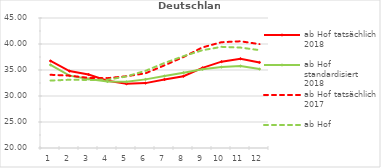
| Category | ab Hof tatsächlich 2018 | ab Hof standardisiert 2018 | ab Hof tatsächlich 2017 | ab Hof standardisiert 2017 |
|---|---|---|---|---|
| 0 | 36.74 | 35.978 | 34.079 | 32.971 |
| 1 | 34.791 | 33.912 | 33.913 | 33.12 |
| 2 | 34.128 | 33.286 | 33.489 | 33.089 |
| 3 | 32.949 | 32.785 | 33.435 | 33.123 |
| 4 | 32.357 | 32.721 | 33.804 | 33.767 |
| 5 | 32.477 | 33.196 | 34.365 | 34.841 |
| 6 | 33.178 | 33.831 | 35.896 | 36.349 |
| 7 | 33.807 | 34.482 | 37.501 | 37.66 |
| 8 | 35.418 | 35.122 | 39.349 | 38.804 |
| 9 | 36.606 | 35.558 | 40.344 | 39.452 |
| 10 | 37.161 | 35.762 | 40.521 | 39.312 |
| 11 | 36.461 | 35.179 | 39.976 | 38.817 |